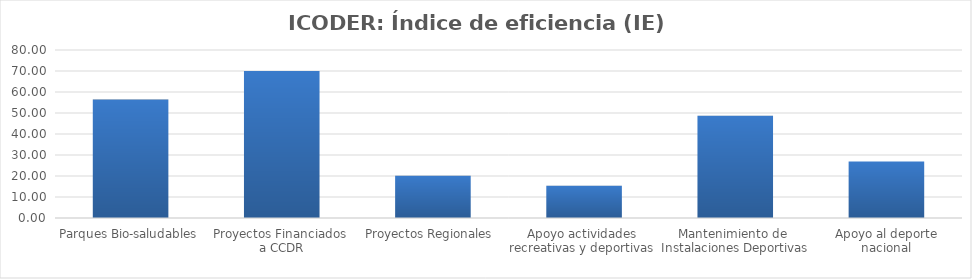
| Category | Índice de eficiencia (IE)  |
|---|---|
| Parques Bio-saludables | 56.378 |
| Proyectos Financiados 
a CCDR | 70 |
| Proyectos Regionales  | 20.15 |
| Apoyo actividades 
recreativas y deportivas  | 15.337 |
| Mantenimiento de 
Instalaciones Deportivas  | 48.68 |
| Apoyo al deporte nacional | 26.919 |